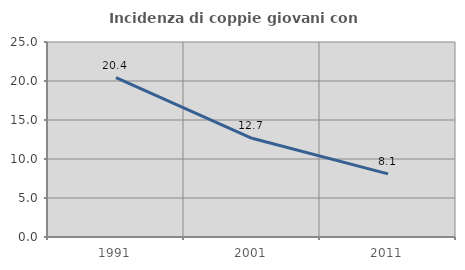
| Category | Incidenza di coppie giovani con figli |
|---|---|
| 1991.0 | 20.421 |
| 2001.0 | 12.652 |
| 2011.0 | 8.097 |